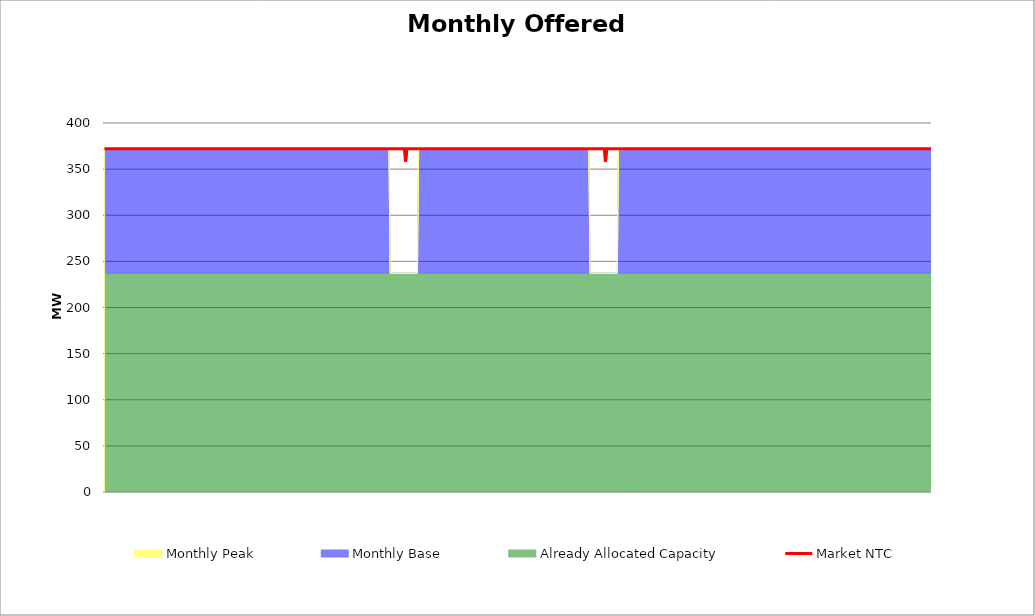
| Category | Market NTC |
|---|---|
| 0 | 372 |
| 1 | 372 |
| 2 | 372 |
| 3 | 372 |
| 4 | 372 |
| 5 | 372 |
| 6 | 372 |
| 7 | 372 |
| 8 | 372 |
| 9 | 372 |
| 10 | 372 |
| 11 | 372 |
| 12 | 372 |
| 13 | 372 |
| 14 | 372 |
| 15 | 372 |
| 16 | 372 |
| 17 | 372 |
| 18 | 372 |
| 19 | 372 |
| 20 | 372 |
| 21 | 372 |
| 22 | 372 |
| 23 | 372 |
| 24 | 372 |
| 25 | 372 |
| 26 | 372 |
| 27 | 372 |
| 28 | 372 |
| 29 | 372 |
| 30 | 372 |
| 31 | 372 |
| 32 | 372 |
| 33 | 372 |
| 34 | 372 |
| 35 | 372 |
| 36 | 372 |
| 37 | 372 |
| 38 | 372 |
| 39 | 372 |
| 40 | 372 |
| 41 | 372 |
| 42 | 372 |
| 43 | 372 |
| 44 | 372 |
| 45 | 372 |
| 46 | 372 |
| 47 | 372 |
| 48 | 372 |
| 49 | 372 |
| 50 | 372 |
| 51 | 372 |
| 52 | 372 |
| 53 | 372 |
| 54 | 372 |
| 55 | 372 |
| 56 | 372 |
| 57 | 372 |
| 58 | 372 |
| 59 | 372 |
| 60 | 372 |
| 61 | 372 |
| 62 | 372 |
| 63 | 372 |
| 64 | 372 |
| 65 | 372 |
| 66 | 372 |
| 67 | 372 |
| 68 | 372 |
| 69 | 372 |
| 70 | 372 |
| 71 | 372 |
| 72 | 372 |
| 73 | 372 |
| 74 | 372 |
| 75 | 372 |
| 76 | 372 |
| 77 | 372 |
| 78 | 372 |
| 79 | 372 |
| 80 | 372 |
| 81 | 372 |
| 82 | 372 |
| 83 | 372 |
| 84 | 372 |
| 85 | 372 |
| 86 | 372 |
| 87 | 372 |
| 88 | 372 |
| 89 | 372 |
| 90 | 372 |
| 91 | 372 |
| 92 | 372 |
| 93 | 372 |
| 94 | 372 |
| 95 | 372 |
| 96 | 372 |
| 97 | 372 |
| 98 | 372 |
| 99 | 372 |
| 100 | 372 |
| 101 | 372 |
| 102 | 372 |
| 103 | 372 |
| 104 | 372 |
| 105 | 372 |
| 106 | 372 |
| 107 | 372 |
| 108 | 372 |
| 109 | 372 |
| 110 | 372 |
| 111 | 372 |
| 112 | 372 |
| 113 | 372 |
| 114 | 372 |
| 115 | 372 |
| 116 | 372 |
| 117 | 372 |
| 118 | 372 |
| 119 | 372 |
| 120 | 372 |
| 121 | 372 |
| 122 | 372 |
| 123 | 372 |
| 124 | 372 |
| 125 | 372 |
| 126 | 372 |
| 127 | 372 |
| 128 | 372 |
| 129 | 372 |
| 130 | 372 |
| 131 | 372 |
| 132 | 372 |
| 133 | 372 |
| 134 | 372 |
| 135 | 372 |
| 136 | 372 |
| 137 | 372 |
| 138 | 372 |
| 139 | 372 |
| 140 | 372 |
| 141 | 372 |
| 142 | 372 |
| 143 | 372 |
| 144 | 372 |
| 145 | 372 |
| 146 | 372 |
| 147 | 372 |
| 148 | 372 |
| 149 | 372 |
| 150 | 372 |
| 151 | 372 |
| 152 | 372 |
| 153 | 372 |
| 154 | 372 |
| 155 | 372 |
| 156 | 372 |
| 157 | 372 |
| 158 | 372 |
| 159 | 372 |
| 160 | 372 |
| 161 | 372 |
| 162 | 372 |
| 163 | 372 |
| 164 | 372 |
| 165 | 372 |
| 166 | 372 |
| 167 | 372 |
| 168 | 372 |
| 169 | 372 |
| 170 | 372 |
| 171 | 372 |
| 172 | 372 |
| 173 | 372 |
| 174 | 372 |
| 175 | 372 |
| 176 | 372 |
| 177 | 372 |
| 178 | 372 |
| 179 | 372 |
| 180 | 372 |
| 181 | 372 |
| 182 | 372 |
| 183 | 372 |
| 184 | 372 |
| 185 | 372 |
| 186 | 372 |
| 187 | 372 |
| 188 | 372 |
| 189 | 372 |
| 190 | 372 |
| 191 | 372 |
| 192 | 372 |
| 193 | 372 |
| 194 | 372 |
| 195 | 372 |
| 196 | 372 |
| 197 | 372 |
| 198 | 372 |
| 199 | 372 |
| 200 | 372 |
| 201 | 372 |
| 202 | 372 |
| 203 | 372 |
| 204 | 372 |
| 205 | 372 |
| 206 | 372 |
| 207 | 372 |
| 208 | 372 |
| 209 | 372 |
| 210 | 372 |
| 211 | 372 |
| 212 | 372 |
| 213 | 372 |
| 214 | 372 |
| 215 | 372 |
| 216 | 372 |
| 217 | 372 |
| 218 | 372 |
| 219 | 372 |
| 220 | 372 |
| 221 | 372 |
| 222 | 372 |
| 223 | 372 |
| 224 | 372 |
| 225 | 372 |
| 226 | 372 |
| 227 | 372 |
| 228 | 372 |
| 229 | 372 |
| 230 | 372 |
| 231 | 372 |
| 232 | 372 |
| 233 | 372 |
| 234 | 372 |
| 235 | 372 |
| 236 | 372 |
| 237 | 372 |
| 238 | 372 |
| 239 | 372 |
| 240 | 372 |
| 241 | 372 |
| 242 | 372 |
| 243 | 372 |
| 244 | 372 |
| 245 | 372 |
| 246 | 372 |
| 247 | 372 |
| 248 | 372 |
| 249 | 372 |
| 250 | 372 |
| 251 | 372 |
| 252 | 372 |
| 253 | 358 |
| 254 | 372 |
| 255 | 372 |
| 256 | 372 |
| 257 | 372 |
| 258 | 372 |
| 259 | 372 |
| 260 | 372 |
| 261 | 372 |
| 262 | 372 |
| 263 | 372 |
| 264 | 372 |
| 265 | 372 |
| 266 | 372 |
| 267 | 372 |
| 268 | 372 |
| 269 | 372 |
| 270 | 372 |
| 271 | 372 |
| 272 | 372 |
| 273 | 372 |
| 274 | 372 |
| 275 | 372 |
| 276 | 372 |
| 277 | 372 |
| 278 | 372 |
| 279 | 372 |
| 280 | 372 |
| 281 | 372 |
| 282 | 372 |
| 283 | 372 |
| 284 | 372 |
| 285 | 372 |
| 286 | 372 |
| 287 | 372 |
| 288 | 372 |
| 289 | 372 |
| 290 | 372 |
| 291 | 372 |
| 292 | 372 |
| 293 | 372 |
| 294 | 372 |
| 295 | 372 |
| 296 | 372 |
| 297 | 372 |
| 298 | 372 |
| 299 | 372 |
| 300 | 372 |
| 301 | 372 |
| 302 | 372 |
| 303 | 372 |
| 304 | 372 |
| 305 | 372 |
| 306 | 372 |
| 307 | 372 |
| 308 | 372 |
| 309 | 372 |
| 310 | 372 |
| 311 | 372 |
| 312 | 372 |
| 313 | 372 |
| 314 | 372 |
| 315 | 372 |
| 316 | 372 |
| 317 | 372 |
| 318 | 372 |
| 319 | 372 |
| 320 | 372 |
| 321 | 372 |
| 322 | 372 |
| 323 | 372 |
| 324 | 372 |
| 325 | 372 |
| 326 | 372 |
| 327 | 372 |
| 328 | 372 |
| 329 | 372 |
| 330 | 372 |
| 331 | 372 |
| 332 | 372 |
| 333 | 372 |
| 334 | 372 |
| 335 | 372 |
| 336 | 372 |
| 337 | 372 |
| 338 | 372 |
| 339 | 372 |
| 340 | 372 |
| 341 | 372 |
| 342 | 372 |
| 343 | 372 |
| 344 | 372 |
| 345 | 372 |
| 346 | 372 |
| 347 | 372 |
| 348 | 372 |
| 349 | 372 |
| 350 | 372 |
| 351 | 372 |
| 352 | 372 |
| 353 | 372 |
| 354 | 372 |
| 355 | 372 |
| 356 | 372 |
| 357 | 372 |
| 358 | 372 |
| 359 | 372 |
| 360 | 372 |
| 361 | 372 |
| 362 | 372 |
| 363 | 372 |
| 364 | 372 |
| 365 | 372 |
| 366 | 372 |
| 367 | 372 |
| 368 | 372 |
| 369 | 372 |
| 370 | 372 |
| 371 | 372 |
| 372 | 372 |
| 373 | 372 |
| 374 | 372 |
| 375 | 372 |
| 376 | 372 |
| 377 | 372 |
| 378 | 372 |
| 379 | 372 |
| 380 | 372 |
| 381 | 372 |
| 382 | 372 |
| 383 | 372 |
| 384 | 372 |
| 385 | 372 |
| 386 | 372 |
| 387 | 372 |
| 388 | 372 |
| 389 | 372 |
| 390 | 372 |
| 391 | 372 |
| 392 | 372 |
| 393 | 372 |
| 394 | 372 |
| 395 | 372 |
| 396 | 372 |
| 397 | 372 |
| 398 | 372 |
| 399 | 372 |
| 400 | 372 |
| 401 | 372 |
| 402 | 372 |
| 403 | 372 |
| 404 | 372 |
| 405 | 372 |
| 406 | 372 |
| 407 | 372 |
| 408 | 372 |
| 409 | 372 |
| 410 | 372 |
| 411 | 372 |
| 412 | 372 |
| 413 | 372 |
| 414 | 372 |
| 415 | 372 |
| 416 | 372 |
| 417 | 372 |
| 418 | 372 |
| 419 | 372 |
| 420 | 372 |
| 421 | 358 |
| 422 | 372 |
| 423 | 372 |
| 424 | 372 |
| 425 | 372 |
| 426 | 372 |
| 427 | 372 |
| 428 | 372 |
| 429 | 372 |
| 430 | 372 |
| 431 | 372 |
| 432 | 372 |
| 433 | 372 |
| 434 | 372 |
| 435 | 372 |
| 436 | 372 |
| 437 | 372 |
| 438 | 372 |
| 439 | 372 |
| 440 | 372 |
| 441 | 372 |
| 442 | 372 |
| 443 | 372 |
| 444 | 372 |
| 445 | 372 |
| 446 | 372 |
| 447 | 372 |
| 448 | 372 |
| 449 | 372 |
| 450 | 372 |
| 451 | 372 |
| 452 | 372 |
| 453 | 372 |
| 454 | 372 |
| 455 | 372 |
| 456 | 372 |
| 457 | 372 |
| 458 | 372 |
| 459 | 372 |
| 460 | 372 |
| 461 | 372 |
| 462 | 372 |
| 463 | 372 |
| 464 | 372 |
| 465 | 372 |
| 466 | 372 |
| 467 | 372 |
| 468 | 372 |
| 469 | 372 |
| 470 | 372 |
| 471 | 372 |
| 472 | 372 |
| 473 | 372 |
| 474 | 372 |
| 475 | 372 |
| 476 | 372 |
| 477 | 372 |
| 478 | 372 |
| 479 | 372 |
| 480 | 372 |
| 481 | 372 |
| 482 | 372 |
| 483 | 372 |
| 484 | 372 |
| 485 | 372 |
| 486 | 372 |
| 487 | 372 |
| 488 | 372 |
| 489 | 372 |
| 490 | 372 |
| 491 | 372 |
| 492 | 372 |
| 493 | 372 |
| 494 | 372 |
| 495 | 372 |
| 496 | 372 |
| 497 | 372 |
| 498 | 372 |
| 499 | 372 |
| 500 | 372 |
| 501 | 372 |
| 502 | 372 |
| 503 | 372 |
| 504 | 372 |
| 505 | 372 |
| 506 | 372 |
| 507 | 372 |
| 508 | 372 |
| 509 | 372 |
| 510 | 372 |
| 511 | 372 |
| 512 | 372 |
| 513 | 372 |
| 514 | 372 |
| 515 | 372 |
| 516 | 372 |
| 517 | 372 |
| 518 | 372 |
| 519 | 372 |
| 520 | 372 |
| 521 | 372 |
| 522 | 372 |
| 523 | 372 |
| 524 | 372 |
| 525 | 372 |
| 526 | 372 |
| 527 | 372 |
| 528 | 372 |
| 529 | 372 |
| 530 | 372 |
| 531 | 372 |
| 532 | 372 |
| 533 | 372 |
| 534 | 372 |
| 535 | 372 |
| 536 | 372 |
| 537 | 372 |
| 538 | 372 |
| 539 | 372 |
| 540 | 372 |
| 541 | 372 |
| 542 | 372 |
| 543 | 372 |
| 544 | 372 |
| 545 | 372 |
| 546 | 372 |
| 547 | 372 |
| 548 | 372 |
| 549 | 372 |
| 550 | 372 |
| 551 | 372 |
| 552 | 372 |
| 553 | 372 |
| 554 | 372 |
| 555 | 372 |
| 556 | 372 |
| 557 | 372 |
| 558 | 372 |
| 559 | 372 |
| 560 | 372 |
| 561 | 372 |
| 562 | 372 |
| 563 | 372 |
| 564 | 372 |
| 565 | 372 |
| 566 | 372 |
| 567 | 372 |
| 568 | 372 |
| 569 | 372 |
| 570 | 372 |
| 571 | 372 |
| 572 | 372 |
| 573 | 372 |
| 574 | 372 |
| 575 | 372 |
| 576 | 372 |
| 577 | 372 |
| 578 | 372 |
| 579 | 372 |
| 580 | 372 |
| 581 | 372 |
| 582 | 372 |
| 583 | 372 |
| 584 | 372 |
| 585 | 372 |
| 586 | 372 |
| 587 | 372 |
| 588 | 372 |
| 589 | 372 |
| 590 | 372 |
| 591 | 372 |
| 592 | 372 |
| 593 | 372 |
| 594 | 372 |
| 595 | 372 |
| 596 | 372 |
| 597 | 372 |
| 598 | 372 |
| 599 | 372 |
| 600 | 372 |
| 601 | 372 |
| 602 | 372 |
| 603 | 372 |
| 604 | 372 |
| 605 | 372 |
| 606 | 372 |
| 607 | 372 |
| 608 | 372 |
| 609 | 372 |
| 610 | 372 |
| 611 | 372 |
| 612 | 372 |
| 613 | 372 |
| 614 | 372 |
| 615 | 372 |
| 616 | 372 |
| 617 | 372 |
| 618 | 372 |
| 619 | 372 |
| 620 | 372 |
| 621 | 372 |
| 622 | 372 |
| 623 | 372 |
| 624 | 372 |
| 625 | 372 |
| 626 | 372 |
| 627 | 372 |
| 628 | 372 |
| 629 | 372 |
| 630 | 372 |
| 631 | 372 |
| 632 | 372 |
| 633 | 372 |
| 634 | 372 |
| 635 | 372 |
| 636 | 372 |
| 637 | 372 |
| 638 | 372 |
| 639 | 372 |
| 640 | 372 |
| 641 | 372 |
| 642 | 372 |
| 643 | 372 |
| 644 | 372 |
| 645 | 372 |
| 646 | 372 |
| 647 | 372 |
| 648 | 372 |
| 649 | 372 |
| 650 | 372 |
| 651 | 372 |
| 652 | 372 |
| 653 | 372 |
| 654 | 372 |
| 655 | 372 |
| 656 | 372 |
| 657 | 372 |
| 658 | 372 |
| 659 | 372 |
| 660 | 372 |
| 661 | 372 |
| 662 | 372 |
| 663 | 372 |
| 664 | 372 |
| 665 | 372 |
| 666 | 372 |
| 667 | 372 |
| 668 | 372 |
| 669 | 372 |
| 670 | 372 |
| 671 | 372 |
| 672 | 372 |
| 673 | 372 |
| 674 | 372 |
| 675 | 372 |
| 676 | 372 |
| 677 | 372 |
| 678 | 372 |
| 679 | 372 |
| 680 | 372 |
| 681 | 372 |
| 682 | 372 |
| 683 | 372 |
| 684 | 372 |
| 685 | 372 |
| 686 | 372 |
| 687 | 372 |
| 688 | 372 |
| 689 | 372 |
| 690 | 372 |
| 691 | 372 |
| 692 | 372 |
| 693 | 372 |
| 694 | 372 |
| 695 | 372 |